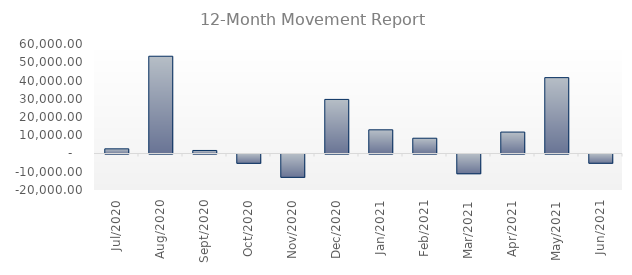
| Category | Value |
|---|---|
| 2020-07-31 | 2547.6 |
| 2020-08-31 | 53292.52 |
| 2020-09-30 | 1665.28 |
| 2020-10-31 | -5107.1 |
| 2020-11-30 | -12788.133 |
| 2020-12-31 | 29633.92 |
| 2021-01-31 | 12972.48 |
| 2021-02-28 | 8372.86 |
| 2021-03-31 | -10843.065 |
| 2021-04-30 | 11740.86 |
| 2021-05-31 | 41574.42 |
| 2021-06-30 | -5074.26 |